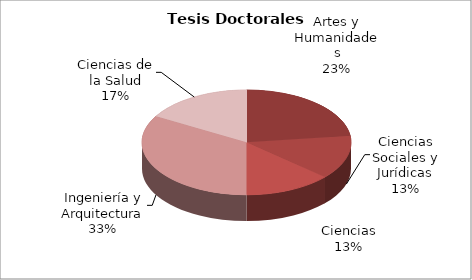
| Category | Series 0 |
|---|---|
| Artes y Humanidades | 29 |
| Ciencias Sociales y Jurídicas | 17 |
| Ciencias | 17 |
| Ingeniería y Arquitectura | 42 |
| Ciencias de la Salud | 21 |